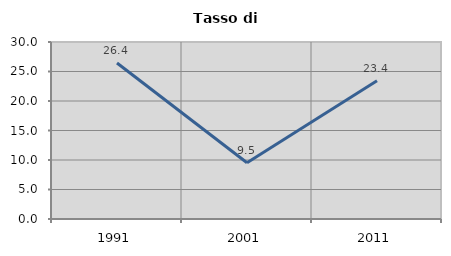
| Category | Tasso di disoccupazione   |
|---|---|
| 1991.0 | 26.444 |
| 2001.0 | 9.524 |
| 2011.0 | 23.415 |